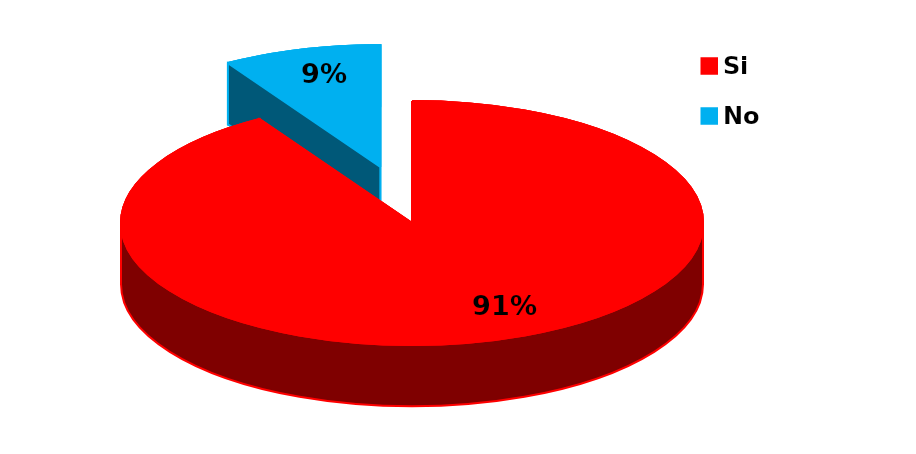
| Category | Series 0 |
|---|---|
| Si | 52 |
| No | 5 |